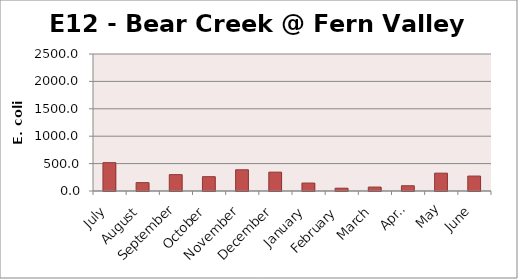
| Category | E. coli MPN |
|---|---|
| July | 517.2 |
| August | 152.9 |
| September | 298.7 |
| October | 261.3 |
| November | 387.3 |
| December | 344.1 |
| January | 145 |
| February | 51.2 |
| March | 71.7 |
| April | 95.9 |
| May | 325.5 |
| June | 272.3 |